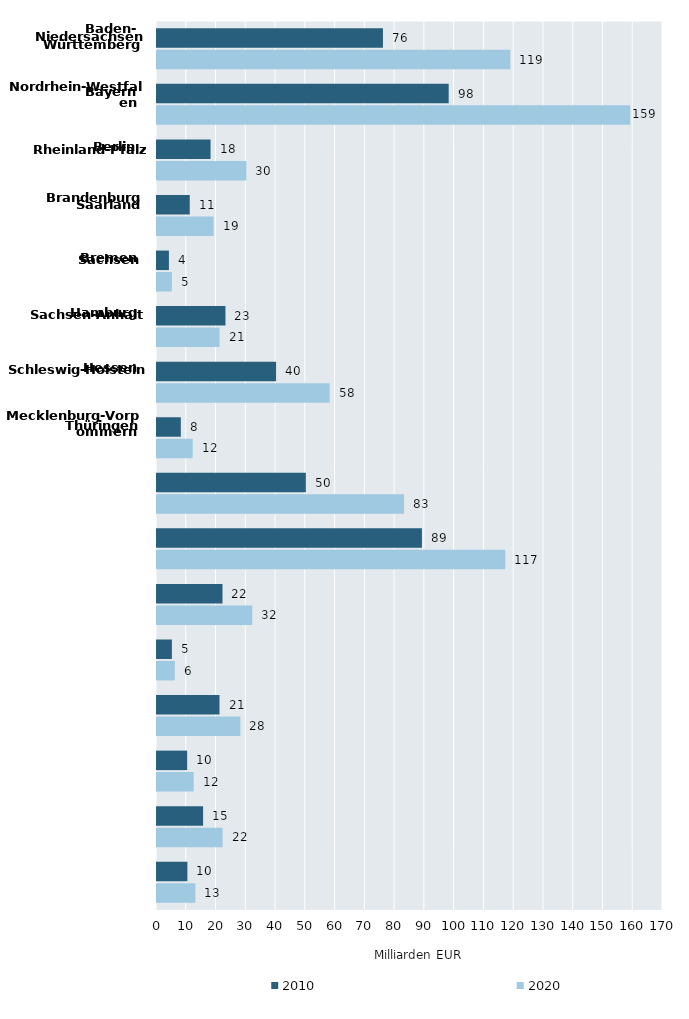
| Category | 2010 | 2020 |
|---|---|---|
| Baden-Württemberg | 75.912 | 118.711 |
| Bayern | 98 | 159 |
| Berlin | 18 | 30 |
| Brandenburg | 11 | 19 |
| Bremen | 4 | 5 |
| Hamburg | 23 | 21 |
| Hessen  | 40 | 58 |
| Mecklenburg-
Vorpommern | 8 | 12 |
| Niedersachsen | 50 | 83 |
| Nordrhein-Westfalen | 89 | 117 |
| Rheinland-Pfalz | 22 | 32 |
| Saarland | 5 | 6 |
| Sachsen | 21 | 28 |
| Sachsen-Anhalt | 10.134 | 12.313 |
| Schleswig-Holstein | 15.486 | 22.048 |
| Thüringen | 10.208 | 12.882 |